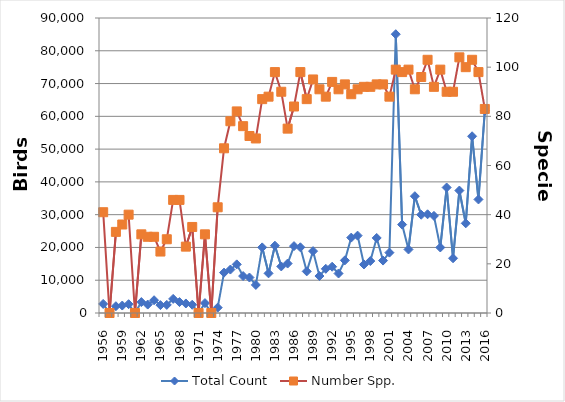
| Category | Total Count |
|---|---|
| 1956.0 | 2765 |
| 1957.0 | 0 |
| 1958.0 | 2071 |
| 1959.0 | 2275 |
| 1960.0 | 2689 |
| 1961.0 | 0 |
| 1962.0 | 3328 |
| 1963.0 | 2573 |
| 1964.0 | 3898 |
| 1965.0 | 2403 |
| 1966.0 | 2473 |
| 1967.0 | 4303 |
| 1968.0 | 3336 |
| 1969.0 | 2904 |
| 1970.0 | 2512 |
| 1971.0 | 0 |
| 1972.0 | 3022 |
| 1973.0 | 0 |
| 1974.0 | 1641 |
| 1975.0 | 12320 |
| 1976.0 | 13255 |
| 1977.0 | 14836 |
| 1978.0 | 11266 |
| 1979.0 | 10823 |
| 1980.0 | 8563 |
| 1981.0 | 20019 |
| 1982.0 | 12095 |
| 1983.0 | 20537 |
| 1984.0 | 14201 |
| 1985.0 | 15091 |
| 1986.0 | 20407 |
| 1987.0 | 20047 |
| 1988.0 | 12698 |
| 1989.0 | 18874 |
| 1990.0 | 11281 |
| 1991.0 | 13478 |
| 1992.0 | 14121 |
| 1993.0 | 12051 |
| 1994.0 | 16059 |
| 1995.0 | 23002 |
| 1996.0 | 23610 |
| 1997.0 | 14810 |
| 1998.0 | 15844 |
| 1999.0 | 22897 |
| 2000.0 | 15997 |
| 2001.0 | 18415 |
| 2002.0 | 85054 |
| 2003.0 | 26976 |
| 2004.0 | 19378 |
| 2005.0 | 35635 |
| 2006.0 | 29983 |
| 2007.0 | 30114 |
| 2008.0 | 29636 |
| 2009.0 | 19988 |
| 2010.0 | 38288 |
| 2011.0 | 16701 |
| 2012.0 | 37357 |
| 2013.0 | 27358 |
| 2014.0 | 53916 |
| 2015.0 | 34640 |
| 2016.0 | 61703 |